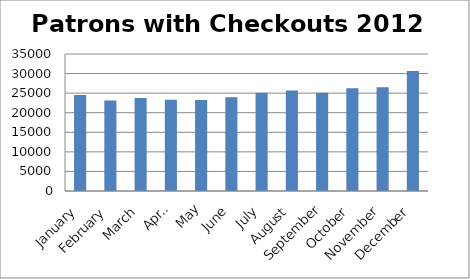
| Category | Series 0 |
|---|---|
| January | 24525 |
| February | 23113 |
| March | 23746 |
| April | 23283 |
| May | 23264 |
| June | 23942 |
| July | 25102 |
| August | 25707 |
| September | 25114 |
| October | 26240 |
| November | 26526 |
| December | 30664 |